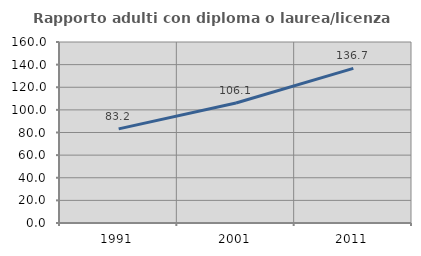
| Category | Rapporto adulti con diploma o laurea/licenza media  |
|---|---|
| 1991.0 | 83.212 |
| 2001.0 | 106.103 |
| 2011.0 | 136.735 |